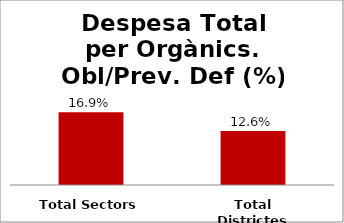
| Category | Series 0 |
|---|---|
| Total Sectors | 0.169 |
| Total Districtes | 0.126 |